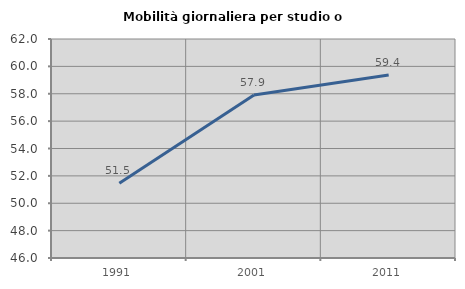
| Category | Mobilità giornaliera per studio o lavoro |
|---|---|
| 1991.0 | 51.463 |
| 2001.0 | 57.903 |
| 2011.0 | 59.367 |